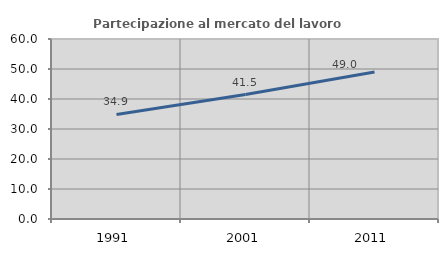
| Category | Partecipazione al mercato del lavoro  femminile |
|---|---|
| 1991.0 | 34.85 |
| 2001.0 | 41.472 |
| 2011.0 | 49.022 |